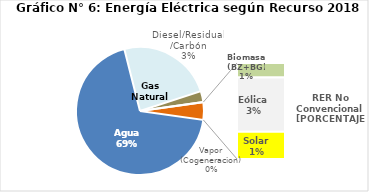
| Category | Series 0 |
|---|---|
| Agua | 3148.548 |
| Gas Natural | 1095.513 |
| Diesel/Residual/Carbón | 126.493 |
| Vapor (Cogeneracion) | 0.373 |
| Biomasa (BZ+BG) | 30.738 |
| Eólica | 115.113 |
| Solar | 58.172 |